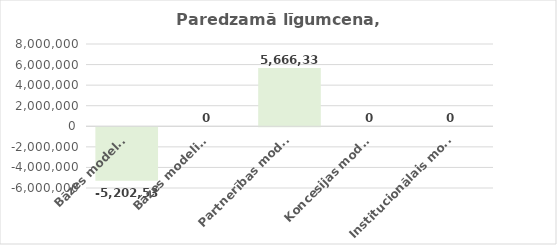
| Category | Series 0 |
|---|---|
| Bāzes modelis I | -5202530.744 |
| Bāzes modelis II | 0 |
| Partnerības modelis | 5666333.734 |
| Koncesijas modelis | 0 |
| Institucionālais modelis | 0 |